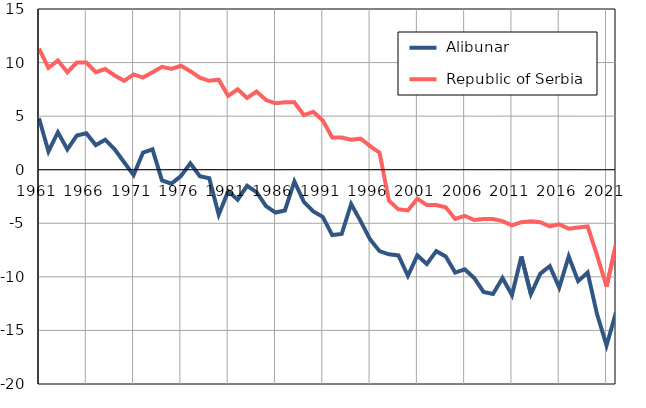
| Category |  Alibunar |  Republic of Serbia |
|---|---|---|
| 1961.0 | 4.8 | 11.3 |
| 1962.0 | 1.7 | 9.5 |
| 1963.0 | 3.5 | 10.2 |
| 1964.0 | 1.9 | 9.1 |
| 1965.0 | 3.2 | 10 |
| 1966.0 | 3.4 | 10 |
| 1967.0 | 2.3 | 9.1 |
| 1968.0 | 2.8 | 9.4 |
| 1969.0 | 1.9 | 8.8 |
| 1970.0 | 0.7 | 8.3 |
| 1971.0 | -0.5 | 8.9 |
| 1972.0 | 1.6 | 8.6 |
| 1973.0 | 1.9 | 9.1 |
| 1974.0 | -1 | 9.6 |
| 1975.0 | -1.3 | 9.4 |
| 1976.0 | -0.6 | 9.7 |
| 1977.0 | 0.6 | 9.2 |
| 1978.0 | -0.6 | 8.6 |
| 1979.0 | -0.8 | 8.3 |
| 1980.0 | -4.2 | 8.4 |
| 1981.0 | -2 | 6.9 |
| 1982.0 | -2.8 | 7.5 |
| 1983.0 | -1.5 | 6.7 |
| 1984.0 | -2.1 | 7.3 |
| 1985.0 | -3.4 | 6.5 |
| 1986.0 | -4 | 6.2 |
| 1987.0 | -3.8 | 6.3 |
| 1988.0 | -1.1 | 6.3 |
| 1989.0 | -3 | 5.1 |
| 1990.0 | -3.9 | 5.4 |
| 1991.0 | -4.4 | 4.6 |
| 1992.0 | -6.1 | 3 |
| 1993.0 | -6 | 3 |
| 1994.0 | -3.2 | 2.8 |
| 1995.0 | -4.8 | 2.9 |
| 1996.0 | -6.5 | 2.2 |
| 1997.0 | -7.6 | 1.6 |
| 1998.0 | -7.9 | -2.9 |
| 1999.0 | -8 | -3.7 |
| 2000.0 | -9.9 | -3.8 |
| 2001.0 | -8 | -2.7 |
| 2002.0 | -8.8 | -3.3 |
| 2003.0 | -7.6 | -3.3 |
| 2004.0 | -8.1 | -3.5 |
| 2005.0 | -9.6 | -4.6 |
| 2006.0 | -9.3 | -4.3 |
| 2007.0 | -10.1 | -4.7 |
| 2008.0 | -11.4 | -4.6 |
| 2009.0 | -11.6 | -4.6 |
| 2010.0 | -10.1 | -4.8 |
| 2011.0 | -11.7 | -5.2 |
| 2012.0 | -8.1 | -4.9 |
| 2013.0 | -11.6 | -4.8 |
| 2014.0 | -9.7 | -4.9 |
| 2015.0 | -9 | -5.3 |
| 2016.0 | -11 | -5.1 |
| 2017.0 | -8.1 | -5.5 |
| 2018.0 | -10.4 | -5.4 |
| 2019.0 | -9.6 | -5.3 |
| 2020.0 | -13.5 | -8 |
| 2021.0 | -16.4 | -10.9 |
| 2022.0 | -13.3 | -7 |